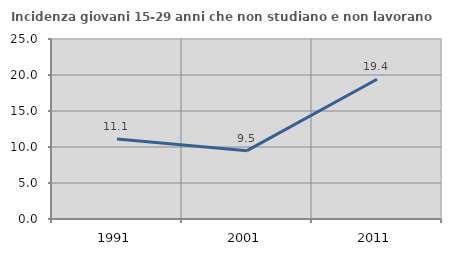
| Category | Incidenza giovani 15-29 anni che non studiano e non lavorano  |
|---|---|
| 1991.0 | 11.111 |
| 2001.0 | 9.494 |
| 2011.0 | 19.408 |